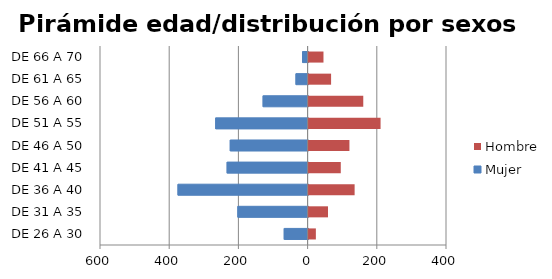
| Category | Mujer | Hombre |
|---|---|---|
| DE 26 A 30 | -69 | 21 |
| DE 31 A 35 | -203 | 56 |
| DE 36 A 40 | -376 | 133 |
| DE 41 A 45 | -234 | 93 |
| DE 46 A 50 | -225 | 118 |
| DE 51 A 55 | -267 | 208 |
| DE 56 A 60 | -130 | 158 |
| DE 61 A 65 | -35 | 65 |
| DE 66 A 70 | -16 | 43 |